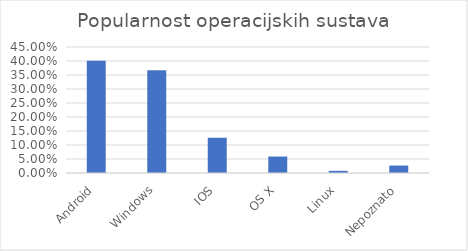
| Category | Series 0 |
|---|---|
| Android | 0.401 |
| Windows | 0.367 |
| IOS | 0.126 |
| OS X | 0.059 |
| Linux | 0.008 |
| Nepoznato | 0.027 |